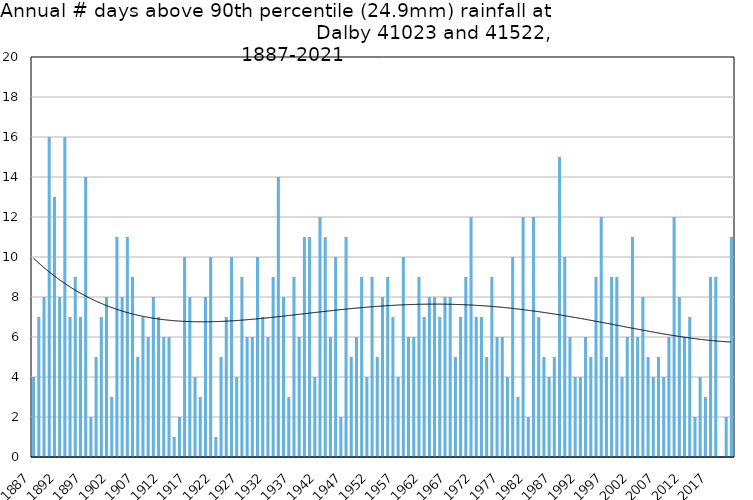
| Category | Annual # days above 90th percentile |
|---|---|
| 1887 | 4 |
| 1888 | 7 |
| 1889 | 8 |
| 1890 | 16 |
| 1891 | 13 |
| 1892 | 8 |
| 1893 | 16 |
| 1894 | 7 |
| 1895 | 9 |
| 1896 | 7 |
| 1897 | 14 |
| 1898 | 2 |
| 1899 | 5 |
| 1900 | 7 |
| 1901 | 8 |
| 1902 | 3 |
| 1903 | 11 |
| 1904 | 8 |
| 1905 | 11 |
| 1906 | 9 |
| 1907 | 5 |
| 1908 | 7 |
| 1909 | 6 |
| 1910 | 8 |
| 1911 | 7 |
| 1912 | 6 |
| 1913 | 6 |
| 1914 | 1 |
| 1915 | 2 |
| 1916 | 10 |
| 1917 | 8 |
| 1918 | 4 |
| 1919 | 3 |
| 1920 | 8 |
| 1921 | 10 |
| 1922 | 1 |
| 1923 | 5 |
| 1924 | 7 |
| 1925 | 10 |
| 1926 | 4 |
| 1927 | 9 |
| 1928 | 6 |
| 1929 | 6 |
| 1930 | 10 |
| 1931 | 7 |
| 1932 | 6 |
| 1933 | 9 |
| 1934 | 14 |
| 1935 | 8 |
| 1936 | 3 |
| 1937 | 9 |
| 1938 | 6 |
| 1939 | 11 |
| 1940 | 11 |
| 1941 | 4 |
| 1942 | 12 |
| 1943 | 11 |
| 1944 | 6 |
| 1945 | 10 |
| 1946 | 2 |
| 1947 | 11 |
| 1948 | 5 |
| 1949 | 6 |
| 1950 | 9 |
| 1951 | 4 |
| 1952 | 9 |
| 1953 | 5 |
| 1954 | 8 |
| 1955 | 9 |
| 1956 | 7 |
| 1957 | 4 |
| 1958 | 10 |
| 1959 | 6 |
| 1960 | 6 |
| 1961 | 9 |
| 1962 | 7 |
| 1963 | 8 |
| 1964 | 8 |
| 1965 | 7 |
| 1966 | 8 |
| 1967 | 8 |
| 1968 | 5 |
| 1969 | 7 |
| 1970 | 9 |
| 1971 | 12 |
| 1972 | 7 |
| 1973 | 7 |
| 1974 | 5 |
| 1975 | 9 |
| 1976 | 6 |
| 1977 | 6 |
| 1978 | 4 |
| 1979 | 10 |
| 1980 | 3 |
| 1981 | 12 |
| 1982 | 2 |
| 1983 | 12 |
| 1984 | 7 |
| 1985 | 5 |
| 1986 | 4 |
| 1987 | 5 |
| 1988 | 15 |
| 1989 | 10 |
| 1990 | 6 |
| 1991 | 4 |
| 1992 | 4 |
| 1993 | 6 |
| 1994 | 5 |
| 1995 | 9 |
| 1996 | 12 |
| 1997 | 5 |
| 1998 | 9 |
| 1999 | 9 |
| 2000 | 4 |
| 2001 | 6 |
| 2002 | 11 |
| 2003 | 6 |
| 2004 | 8 |
| 2005 | 5 |
| 2006 | 4 |
| 2007 | 5 |
| 2008 | 4 |
| 2009 | 6 |
| 2010 | 12 |
| 2011 | 8 |
| 2012 | 6 |
| 2013 | 7 |
| 2014 | 2 |
| 2015 | 4 |
| 2016 | 3 |
| 2017 | 9 |
| 2018 | 9 |
| 2019 | 0 |
| 2020 | 2 |
| 2021 | 11 |